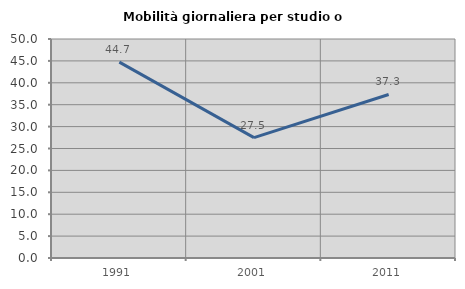
| Category | Mobilità giornaliera per studio o lavoro |
|---|---|
| 1991.0 | 44.726 |
| 2001.0 | 27.485 |
| 2011.0 | 37.333 |